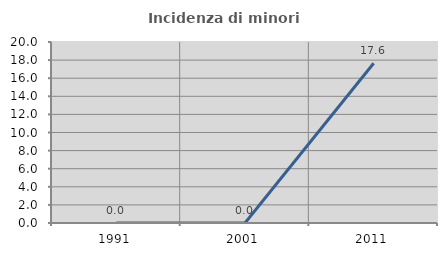
| Category | Incidenza di minori stranieri |
|---|---|
| 1991.0 | 0 |
| 2001.0 | 0 |
| 2011.0 | 17.647 |